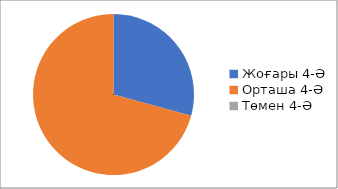
| Category | Series 0 |
|---|---|
| 0 | 4.06 |
| 1 | 9.829 |
| 2 | 0 |